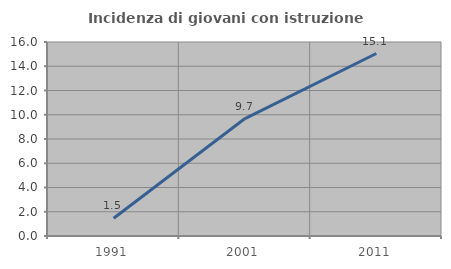
| Category | Incidenza di giovani con istruzione universitaria |
|---|---|
| 1991.0 | 1.462 |
| 2001.0 | 9.685 |
| 2011.0 | 15.05 |